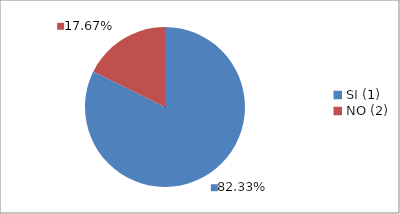
| Category | Series 0 |
|---|---|
| SI (1) | 0.823 |
| NO (2) | 0.177 |